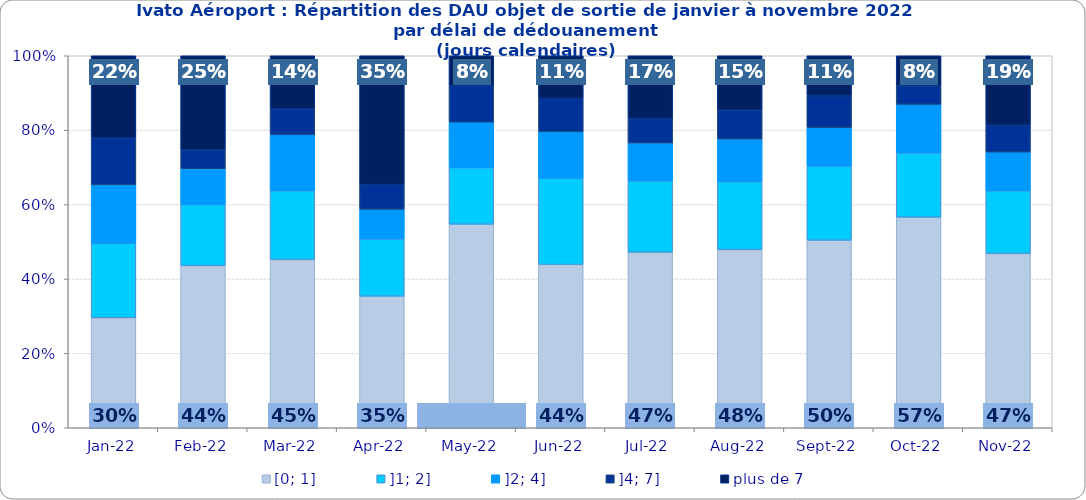
| Category | [0; 1] | ]1; 2] | ]2; 4] | ]4; 7] | plus de 7 |
|---|---|---|---|---|---|
| 2022-01-01 | 0.296 | 0.201 | 0.157 | 0.127 | 0.22 |
| 2022-02-01 | 0.436 | 0.164 | 0.096 | 0.051 | 0.253 |
| 2022-03-01 | 0.452 | 0.185 | 0.151 | 0.069 | 0.143 |
| 2022-04-01 | 0.354 | 0.154 | 0.08 | 0.066 | 0.346 |
| 2022-05-01 | 0.547 | 0.152 | 0.122 | 0.098 | 0.08 |
| 2022-06-01 | 0.439 | 0.232 | 0.125 | 0.09 | 0.114 |
| 2022-07-01 | 0.472 | 0.192 | 0.102 | 0.066 | 0.169 |
| 2022-08-01 | 0.479 | 0.183 | 0.115 | 0.078 | 0.146 |
| 2022-09-01 | 0.504 | 0.199 | 0.104 | 0.086 | 0.107 |
| 2022-10-01 | 0.566 | 0.173 | 0.131 | 0.05 | 0.081 |
| 2022-11-01 | 0.468 | 0.169 | 0.104 | 0.072 | 0.187 |